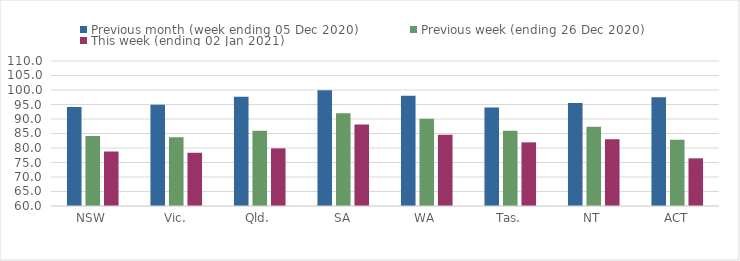
| Category | Previous month (week ending 05 Dec 2020) | Previous week (ending 26 Dec 2020) | This week (ending 02 Jan 2021) |
|---|---|---|---|
| NSW | 94.12 | 84.11 | 78.79 |
| Vic. | 94.91 | 83.72 | 78.36 |
| Qld. | 97.68 | 85.95 | 79.87 |
| SA | 99.9 | 91.95 | 88.08 |
| WA | 98.05 | 90.06 | 84.59 |
| Tas. | 93.95 | 85.93 | 81.94 |
| NT | 95.48 | 87.36 | 83 |
| ACT | 97.54 | 82.81 | 76.44 |